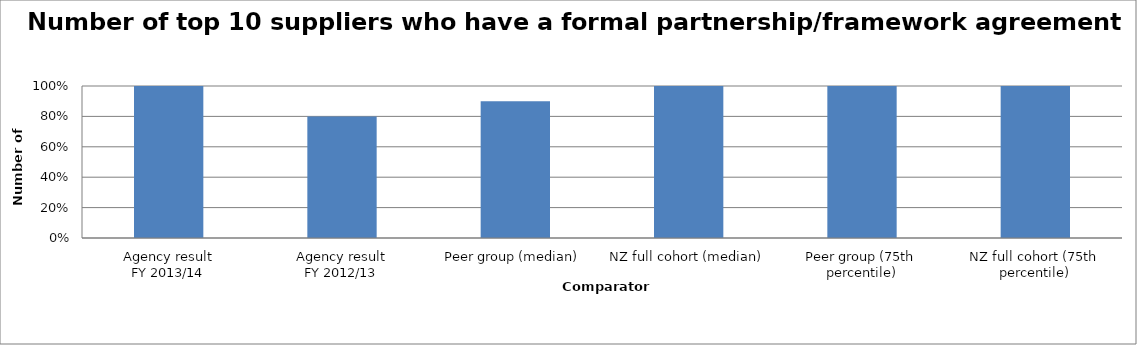
| Category | Series 0 |
|---|---|
| Agency result
FY 2013/14 | 1 |
| Agency result
FY 2012/13 | 0.8 |
| Peer group (median) | 0.9 |
| NZ full cohort (median) | 1 |
| Peer group (75th percentile) | 1 |
| NZ full cohort (75th percentile) | 1 |